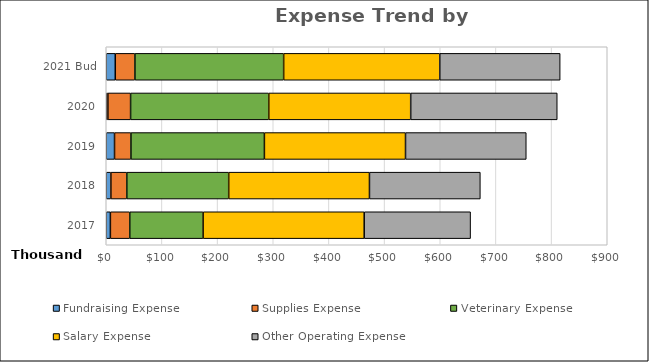
| Category | Fundraising Expense | Supplies Expense | Veterinary Expense | Salary Expense | Other Operating Expense |
|---|---|---|---|---|---|
| 2017 | 7436.66 | 34786.2 | 131756 | 289394.726 | 191121.569 |
| 2018 | 8316.75 | 28618.06 | 183067 | 252820.51 | 199185.87 |
| 2019 | 14872.95 | 29463.38 | 239774.86 | 253473.05 | 216954.6 |
| 2020 | 2933.99 | 40790.28 | 248234.97 | 254941.31 | 263259.05 |
| 2021 Bud | 16200 | 35300 | 267200 | 280403.828 | 216320 |